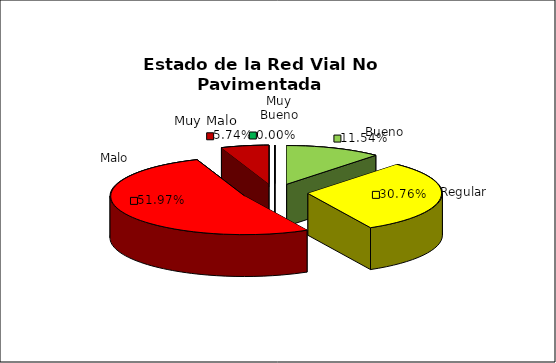
| Category | Series 0 |
|---|---|
| 0 | 0 |
| 1 | 0.115 |
| 2 | 0.308 |
| 3 | 0.52 |
| 4 | 0.057 |